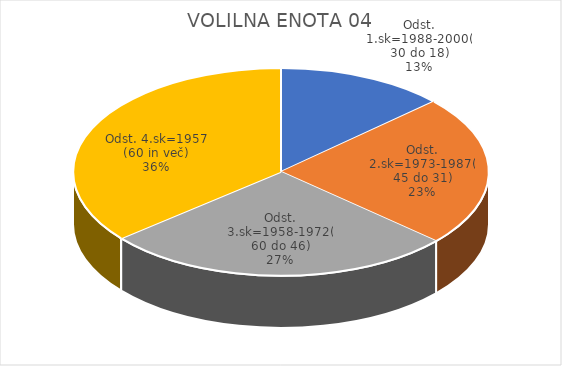
| Category | VOLILNA ENOTA 04 |
|---|---|
| Odst. 1.sk=1988-2000(30 do 18) | 7.13 |
| Odst. 2.sk=1973-1987(45 do 31) | 12.71 |
| Odst. 3.sk=1958-1972(60 do 46) | 14.81 |
| Odst. 4.sk=1957 (60 in več) | 19.54 |